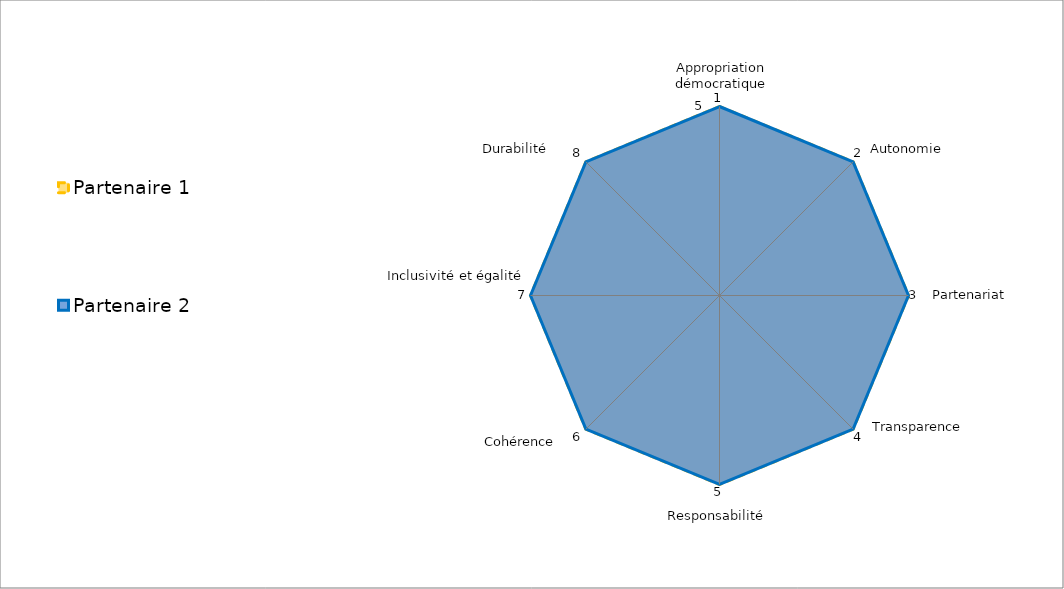
| Category | Partenaire 1 | Partenaire 2 |
|---|---|---|
| 0 | 5 | 5 |
| 1 | 5 | 5 |
| 2 | 5 | 5 |
| 3 | 5 | 5 |
| 4 | 5 | 5 |
| 5 | 5 | 5 |
| 6 | 5 | 5 |
| 7 | 5 | 5 |